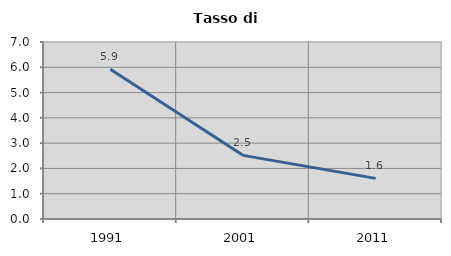
| Category | Tasso di disoccupazione   |
|---|---|
| 1991.0 | 5.918 |
| 2001.0 | 2.517 |
| 2011.0 | 1.606 |